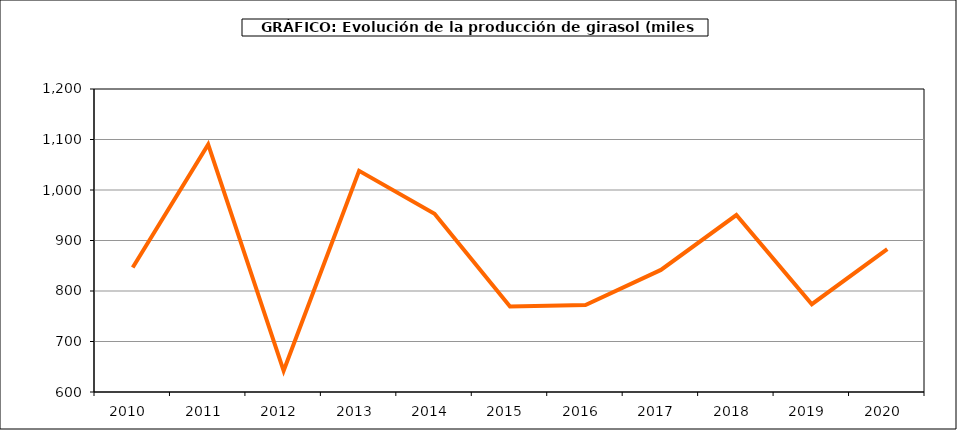
| Category | Producción |
|---|---|
| 2010.0 | 846.648 |
| 2011.0 | 1090.171 |
| 2012.0 | 642.017 |
| 2013.0 | 1038.071 |
| 2014.0 | 952.986 |
| 2015.0 | 769.195 |
| 2016.0 | 772.18 |
| 2017.0 | 841.74 |
| 2018.0 | 950.346 |
| 2019.0 | 773.787 |
| 2020.0 | 883.094 |